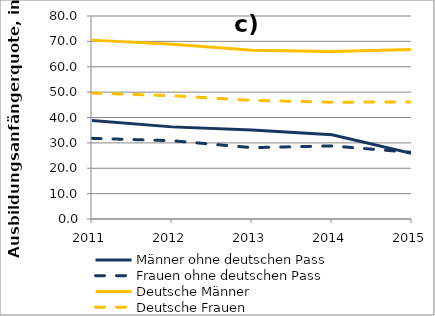
| Category | Männer ohne deutschen Pass | Frauen ohne deutschen Pass | Deutsche Männer | Deutsche Frauen |
|---|---|---|---|---|
| 2011.0 | 38.839 | 31.784 | 70.492 | 49.626 |
| 2012.0 | 36.306 | 30.855 | 68.907 | 48.586 |
| 2013.0 | 35.061 | 28.123 | 66.463 | 46.75 |
| 2014.0 | 33.192 | 28.805 | 66.015 | 46.021 |
| 2015.0 | 25.794 | 26.241 | 66.818 | 46.146 |